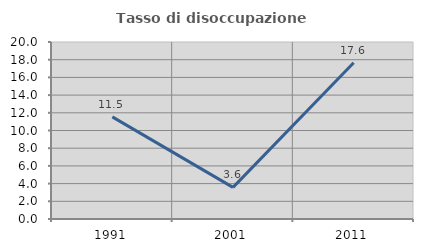
| Category | Tasso di disoccupazione giovanile  |
|---|---|
| 1991.0 | 11.538 |
| 2001.0 | 3.571 |
| 2011.0 | 17.647 |